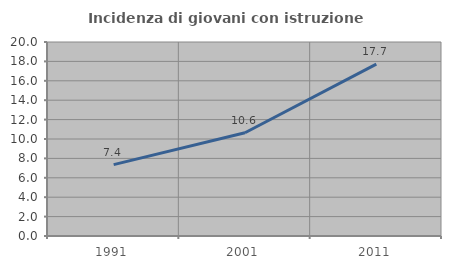
| Category | Incidenza di giovani con istruzione universitaria |
|---|---|
| 1991.0 | 7.354 |
| 2001.0 | 10.648 |
| 2011.0 | 17.723 |